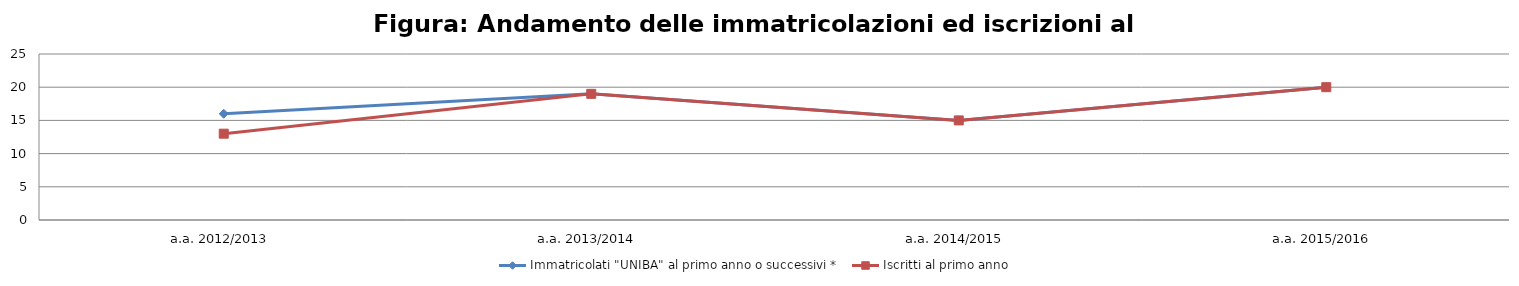
| Category | Immatricolati "UNIBA" al primo anno o successivi * | Iscritti al primo anno  |
|---|---|---|
| a.a. 2012/2013 | 16 | 13 |
| a.a. 2013/2014 | 19 | 19 |
| a.a. 2014/2015 | 15 | 15 |
| a.a. 2015/2016 | 20 | 20 |